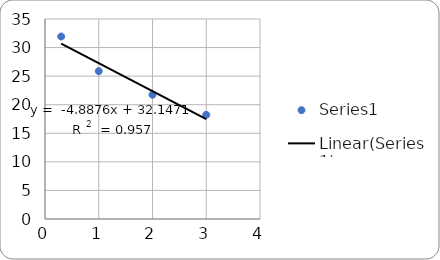
| Category | Series 0 |
|---|---|
| 3.0 | 18.238 |
| 2.0 | 21.745 |
| 1.0 | 25.873 |
| 0.3010299956639812 | 31.935 |